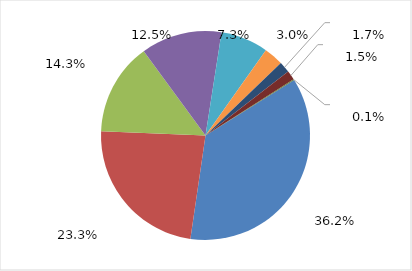
| Category | Series 0 |
|---|---|
| Sonova Norway AS | 35953 |
| Oticon AS | 23189 |
| GN Hearing Norway AS | 14183 |
| Sivantos AS | 12431 |
| Widex Norge AS | 7295 |
| Starkey Norway AS | 2994 |
| Medus AS | 1692 |
| Cantec AS | 1444 |
| Cochlear Norway AS | 134 |